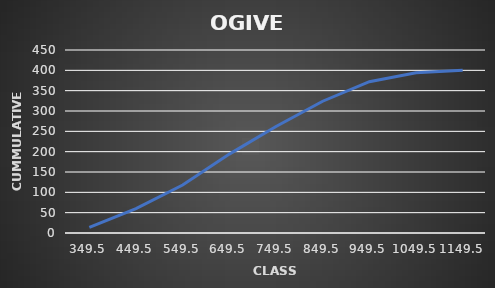
| Category | Series 0 |
|---|---|
| 349.5 | 14 |
| 449.5 | 60 |
| 549.5 | 118 |
| 649.5 | 194 |
| 749.5 | 262 |
| 849.5 | 324 |
| 949.5 | 372 |
| 1049.5 | 394 |
| 1149.5 | 400 |